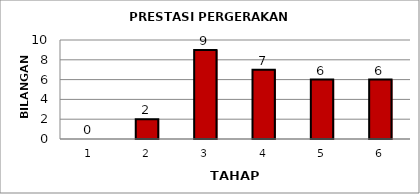
| Category | Series 0 |
|---|---|
| 1.0 | 0 |
| 2.0 | 2 |
| 3.0 | 9 |
| 4.0 | 7 |
| 5.0 | 6 |
| 6.0 | 6 |